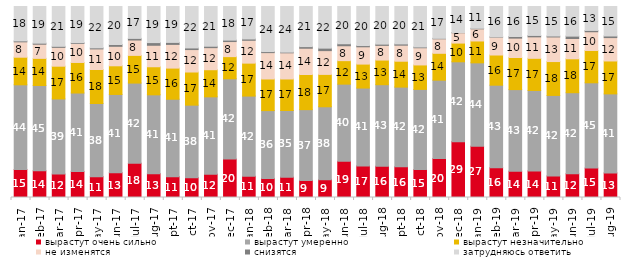
| Category | вырастут очень сильно | вырастут умеренно | вырастут незначительно | не изменятся | снизятся | затрудняюсь ответить |
|---|---|---|---|---|---|---|
| 2017-01-01 | 14.65 | 44.35 | 14.45 | 8.05 | 0.5 | 18 |
| 2017-02-01 | 13.95 | 44.7 | 14.2 | 7.4 | 0.55 | 19.2 |
| 2017-03-01 | 12.25 | 39.35 | 17.15 | 9.85 | 0.55 | 20.85 |
| 2017-04-01 | 13.55 | 41.15 | 16 | 9.95 | 0.4 | 18.95 |
| 2017-05-01 | 10.9 | 38.3 | 17.8 | 10.8 | 0.55 | 21.65 |
| 2017-06-01 | 13 | 40.95 | 15 | 10.2 | 0.95 | 19.9 |
| 2017-07-01 | 17.95 | 41.95 | 14.5 | 8.05 | 0.85 | 16.7 |
| 2017-08-01 | 12.5 | 41.25 | 14.7 | 11.25 | 1.4 | 18.9 |
| 2017-09-01 | 10.9 | 40.55 | 16.3 | 12.4 | 1.05 | 18.8 |
| 2017-10-01 | 10.4 | 37.95 | 17.35 | 11.75 | 0.85 | 21.7 |
| 2017-11-01 | 12.2 | 40.5 | 14.2 | 11.55 | 0.75 | 20.8 |
| 2017-12-01 | 20.1 | 42.05 | 11.6 | 7.9 | 0.75 | 17.6 |
| 2018-01-01 | 11.1 | 42 | 17.25 | 11.95 | 0.7 | 17 |
| 2018-02-01 | 10 | 35.5 | 16.55 | 13.8 | 0.55 | 23.6 |
| 2018-03-01 | 10.65 | 34.9 | 16.5 | 13.7 | 0.35 | 23.9 |
| 2018-04-01 | 8.95 | 37.05 | 18.4 | 13.75 | 0.85 | 21 |
| 2018-05-01 | 9.3 | 38.2 | 16.95 | 12.45 | 1.3 | 21.8 |
| 2018-06-01 | 18.95 | 40.4 | 12.3 | 7.8 | 1.05 | 19.5 |
| 2018-07-01 | 16.55 | 40.75 | 12.55 | 9.05 | 0.65 | 20.45 |
| 2018-08-01 | 16.35 | 42.7 | 12.9 | 7.7 | 0.65 | 19.7 |
| 2018-09-01 | 16.05 | 41.75 | 13.55 | 8.4 | 0.65 | 19.6 |
| 2018-10-01 | 14.6 | 42 | 12.8 | 9 | 0.4 | 21.2 |
| 2018-11-01 | 20.359 | 41.068 | 14.072 | 7.585 | 0.25 | 16.667 |
| 2018-12-01 | 29.25 | 41.8 | 9.8 | 5.4 | 0.1 | 13.65 |
| 2019-01-01 | 26.85 | 43.65 | 11.45 | 6.35 | 0.3 | 11.4 |
| 2019-02-01 | 15.6 | 43.2 | 15.8 | 9.35 | 0.15 | 15.9 |
| 2019-03-01 | 13.774 | 42.715 | 16.808 | 10.144 | 0.845 | 15.714 |
| 2019-04-01 | 13.911 | 42.129 | 16.832 | 11.238 | 0.743 | 15.149 |
| 2019-05-01 | 11.293 | 42.15 | 17.732 | 12.878 | 0.495 | 15.453 |
| 2019-06-01 | 12.419 | 42.444 | 17.756 | 10.623 | 1.247 | 15.511 |
| 2019-07-01 | 15.396 | 44.653 | 16.931 | 9.802 | 0.693 | 12.525 |
| 2019-08-01 | 12.887 | 41.359 | 17.233 | 12.238 | 0.849 | 15.435 |